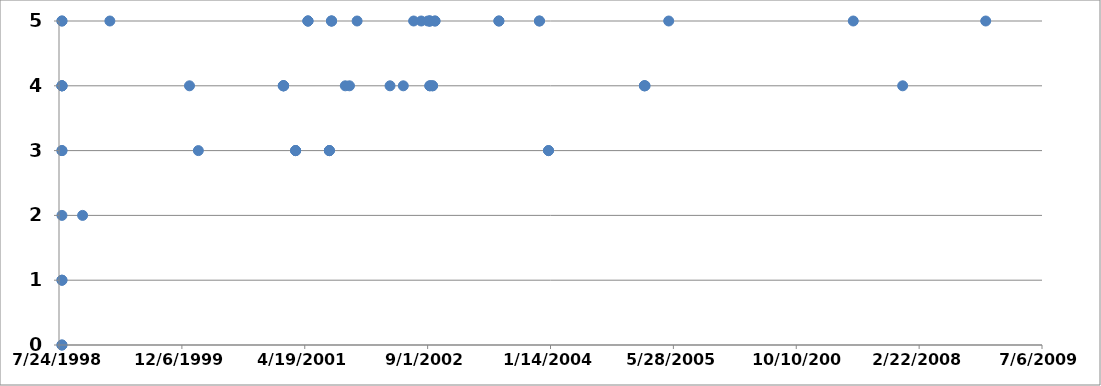
| Category | Series 0 |
|---|---|
| 39771.0 | 5 |
| 39433.0 | 4 |
| 39232.0 | 5 |
| 38481.0 | 5 |
| 38385.0 | 4 |
| 38382.0 | 4 |
| 37992.0 | 3 |
| 37955.0 | 5 |
| 37790.0 | 5 |
| 37530.0 | 5 |
| 38382.0 | 4 |
| 37992.0 | 3 |
| 37955.0 | 5 |
| 37790.0 | 5 |
| 37530.0 | 5 |
| 37520.0 | 4 |
| 37509.0 | 4 |
| 37509.0 | 5 |
| 37501.0 | 5 |
| 37474.0 | 5 |
| 37520.0 | 4 |
| 37509.0 | 4 |
| 37509.0 | 5 |
| 37508.0 | 5 |
| 37443.0 | 5 |
| 37401.0 | 4 |
| 37347.0 | 4 |
| 37213.0 | 5 |
| 37182.0 | 4 |
| 37165.0 | 4 |
| 37109.0 | 5 |
| 37100.0 | 3 |
| 37013.0 | 5 |
| 36963.0 | 3 |
| 36914.0 | 4 |
| 37109.0 | 5 |
| 37100.0 | 3 |
| 37013.0 | 5 |
| 36963.0 | 3 |
| 36914.0 | 4 |
| 37109.0 | 5 |
| 37100.0 | 3 |
| 37013.0 | 5 |
| 36963.0 | 3 |
| 36914.0 | 4 |
| 36912.0 | 4 |
| 36567.0 | 3 |
| 36531.0 | 4 |
| 36207.0 | 5 |
| 36096.0 | 2 |
| 36012.0 | 4 |
| 36012.0 | 1 |
| 36012.0 | 0 |
| 36012.0 | 4 |
| 36012.0 | 5 |
| 36012.0 | 4 |
| 36012.0 | 1 |
| 36012.0 | 0 |
| 36012.0 | 4 |
| 36012.0 | 5 |
| 36012.0 | 2 |
| 36012.0 | 3 |
| 36012.0 | 3 |